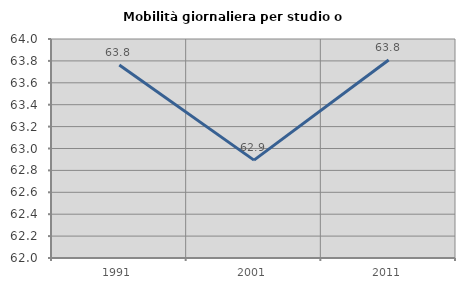
| Category | Mobilità giornaliera per studio o lavoro |
|---|---|
| 1991.0 | 63.762 |
| 2001.0 | 62.894 |
| 2011.0 | 63.808 |